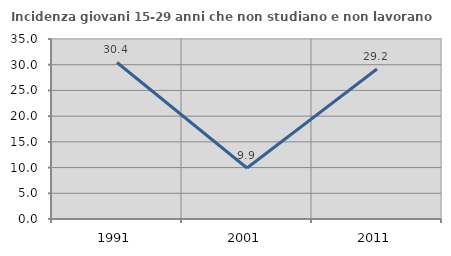
| Category | Incidenza giovani 15-29 anni che non studiano e non lavorano  |
|---|---|
| 1991.0 | 30.435 |
| 2001.0 | 9.917 |
| 2011.0 | 29.167 |